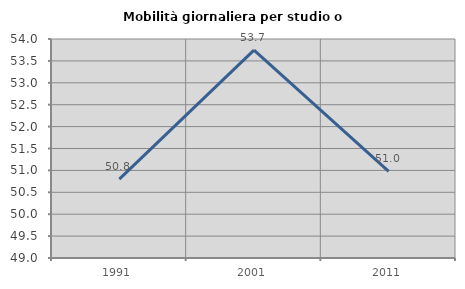
| Category | Mobilità giornaliera per studio o lavoro |
|---|---|
| 1991.0 | 50.802 |
| 2001.0 | 53.747 |
| 2011.0 | 50.978 |